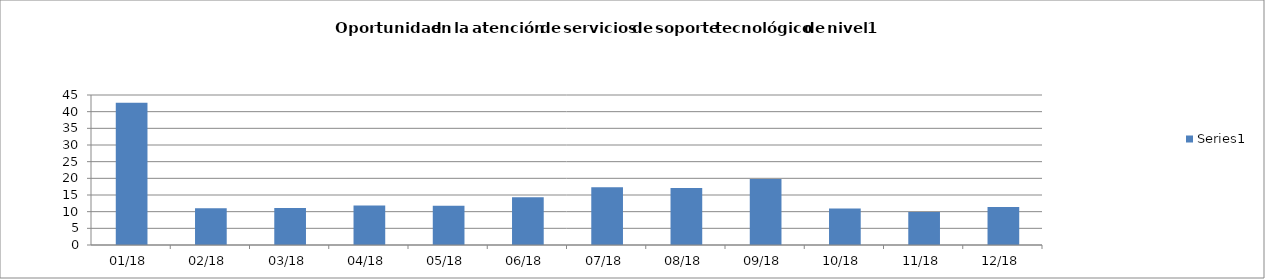
| Category | Series 0 |
|---|---|
| 2018-01-01 | 42.64 |
| 2018-02-01 | 11.04 |
| 2018-03-01 | 11.12 |
| 2018-04-01 | 11.84 |
| 2018-05-01 | 11.76 |
| 2018-06-01 | 14.32 |
| 2018-07-01 | 17.34 |
| 2018-08-01 | 17.1 |
| 2018-09-01 | 19.83 |
| 2018-10-01 | 10.98 |
| 2018-11-01 | 9.93 |
| 2018-12-01 | 11.43 |